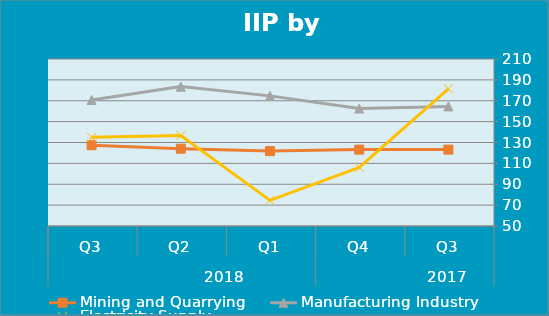
| Category | Mining and Quarrying | Manufacturing Industry | Electricity Supply |
|---|---|---|---|
| 0 | 123.2 | 164.6 | 181.44 |
| 1 | 123.18 | 162.54 | 106.12 |
| 2 | 121.76 | 174.68 | 74.56 |
| 3 | 124.06 | 183.53 | 136.79 |
| 4 | 127.38 | 170.7 | 134.96 |